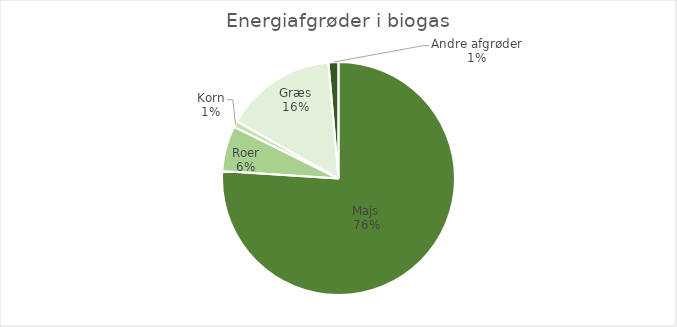
| Category | Series 0 |
|---|---|
| Majs | 380318.9 |
| Roer | 31479.08 |
| Korn | 4196.68 |
| Græs | 77466.36 |
| Andre afgrøder | 6891 |